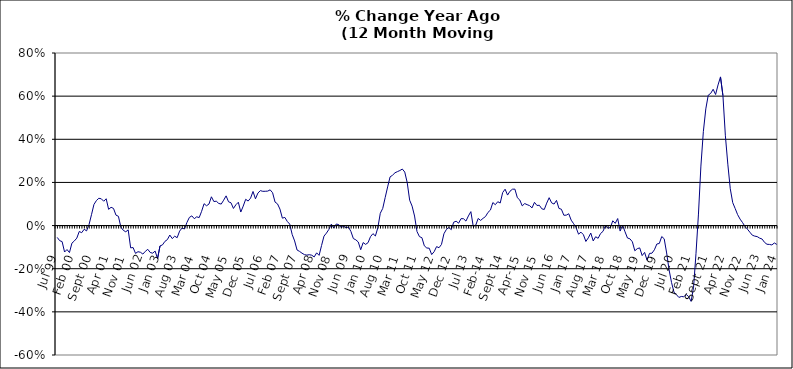
| Category | Series 0 |
|---|---|
| Jul 99 | -0.055 |
| Aug 99 | -0.07 |
| Sep 99 | -0.074 |
| Oct 99 | -0.123 |
| Nov 99 | -0.111 |
| Dec 99 | -0.125 |
| Jan 00 | -0.082 |
| Feb 00 | -0.071 |
| Mar 00 | -0.058 |
| Apr 00 | -0.027 |
| May 00 | -0.033 |
| Jun 00 | -0.017 |
| Jul 00 | -0.025 |
| Aug 00 | 0.005 |
| Sep 00 | 0.05 |
| Oct 00 | 0.098 |
| Nov 00 | 0.116 |
| Dec 00 | 0.127 |
| Jan 01 | 0.124 |
| Feb 01 | 0.113 |
| Mar 01 | 0.124 |
| Apr 01 | 0.075 |
| May 01 | 0.085 |
| Jun 01 | 0.08 |
| Jul 01 | 0.048 |
| Aug 01 | 0.043 |
| Sep 01 | -0.007 |
| Oct 01 | -0.022 |
| Nov 01 | -0.029 |
| Dec 01 | -0.02 |
| Jan 02 | -0.103 |
| Feb 02 | -0.102 |
| Mar 02 | -0.129 |
| Apr 02 | -0.121 |
| May 02 | -0.124 |
| Jun 02 | -0.132 |
| Jul 02 | -0.119 |
| Aug 02 | -0.11 |
| Sep 02 | -0.125 |
| Oct 02 | -0.128 |
| Nov 02 | -0.118 |
| Dec 02 | -0.153 |
| Jan 03 | -0.094 |
| Feb 03 | -0.09 |
| Mar 03 | -0.073 |
| Apr 03 | -0.065 |
| May 03 | -0.044 |
| Jun 03 | -0.06 |
| Jul 03 | -0.049 |
| Aug 03 | -0.056 |
| Sep 03 | -0.026 |
| Oct 03 | -0.012 |
| Nov 03 | -0.016 |
| Dec 03 | 0.014 |
| Jan 04 | 0.038 |
| Feb 04 | 0.045 |
| Mar 04 | 0.032 |
| Apr 04 | 0.041 |
| May 04 | 0.037 |
| Jun 04 | 0.066 |
| Jul 04 | 0.101 |
| Aug 04 | 0.092 |
| Sep 04 | 0.1 |
| Oct 04 | 0.133 |
| Nov 04 | 0.111 |
| Dec 04 | 0.113 |
| Jan 05 | 0.103 |
| Feb 05 | 0.1 |
| Mar 05 | 0.118 |
| Apr 05 | 0.138 |
| May 05 | 0.11 |
| Jun 05 | 0.106 |
| Jul 05 | 0.079 |
| Aug 05 | 0.097 |
| Sep 05 | 0.108 |
| Oct 05 | 0.063 |
| Nov 05 | 0.09 |
| Dec 05 | 0.122 |
| Jan 06 | 0.114 |
| Feb 06 | 0.127 |
| Mar 06 | 0.158 |
| Apr 06 | 0.124 |
| May 06 | 0.151 |
| Jun 06 | 0.162 |
| Jul 06 | 0.159 |
| Aug 06 | 0.159 |
| Sep 06 | 0.16 |
| Oct 06 | 0.166 |
| Nov 06 | 0.152 |
| Dec 06 | 0.109 |
| Jan 07 | 0.101 |
| Feb 07 | 0.076 |
| Mar 07 | 0.034 |
| Apr 07 | 0.038 |
| May 07 | 0.019 |
| Jun 07 | 0.007 |
| Jul 07 | -0.041 |
| Aug 07 | -0.071 |
| Sep 07 | -0.113 |
| Oct 07 | -0.12 |
| Nov 07 | -0.128 |
| Dec 07 | -0.135 |
| Jan 08 | -0.137 |
| Feb 08 | -0.135 |
| Mar 08 | -0.137 |
| Apr 08 | -0.145 |
| May 08 | -0.126 |
| Jun 08 | -0.138 |
| Jul 08 | -0.093 |
| Aug 08 | -0.049 |
| Sep-08 | -0.035 |
| Oct 08 | -0.018 |
| Nov 08 | 0.007 |
| Dec 08 | -0.011 |
| Jan 09 | 0.007 |
| Feb 09 | 0.005 |
| Mar 09 | -0.009 |
| Apr 09 | -0.003 |
| May 09 | -0.01 |
| Jun 09 | -0.007 |
| Jul 09 | -0.027 |
| Aug 09 | -0.06 |
| Sep 09 | -0.066 |
| Oct 09 | -0.076 |
| Nov 09 | -0.112 |
| Dec 09 | -0.079 |
| Jan 10 | -0.087 |
| Feb 10 | -0.079 |
| Mar 10 | -0.052 |
| Apr 10 | -0.037 |
| May 10 | -0.048 |
| Jun 10 | -0.01 |
| Jul 10 | 0.057 |
| Aug 10 | 0.08 |
| Sep 10 | 0.13 |
| Oct 10 | 0.179 |
| Nov 10 | 0.226 |
| Dec 10 | 0.233 |
| Jan 11 | 0.245 |
| Feb 11 | 0.25 |
| Mar 11 | 0.255 |
| Apr 11 | 0.262 |
| May 11 | 0.248 |
| Jun 11 | 0.199 |
| Jul 11 | 0.118 |
| Aug 11 | 0.09 |
| Sep 11 | 0.044 |
| Oct 11 | -0.028 |
| Nov 11 | -0.051 |
| Dec 11 | -0.056 |
| Jan 12 | -0.094 |
| Feb 12 | -0.104 |
| Mar 12 | -0.105 |
| Apr 12 | -0.134 |
| May 12 | -0.121 |
| Jun 12 | -0.098 |
| Jul 12 | -0.103 |
| Aug 12 | -0.087 |
| Sep 12 | -0.038 |
| Oct 12 | -0.018 |
| Nov 12 | -0.009 |
| Dec 12 | -0.019 |
| Jan 13 | 0.016 |
| Feb-13 | 0.02 |
| Mar-13 | 0.011 |
| Apr 13 | 0.032 |
| May 13 | 0.032 |
| Jun-13 | 0.021 |
| Jul 13 | 0.045 |
| Aug 13 | 0.065 |
| Sep 13 | -0.005 |
| Oct 13 | 0.002 |
| Nov 13 | 0.033 |
| Dec 13 | 0.024 |
| Jan 14 | 0.034 |
| Feb-14 | 0.042 |
| Mar 14 | 0.061 |
| Apr 14 | 0.072 |
| May 14 | 0.107 |
| Jun 14 | 0.097 |
| Jul-14 | 0.111 |
| Aug-14 | 0.105 |
| Sep 14 | 0.153 |
| Oct 14 | 0.169 |
| Nov 14 | 0.141 |
| Dec 14 | 0.159 |
| Jan 15 | 0.169 |
| Feb 15 | 0.169 |
| Mar 15 | 0.129 |
| Apr-15 | 0.118 |
| May 15 | 0.091 |
| Jun-15 | 0.102 |
| Jul 15 | 0.097 |
| Aug 15 | 0.092 |
| Sep 15 | 0.082 |
| Oct 15 | 0.108 |
| Nov 15 | 0.093 |
| Dec 15 | 0.094 |
| Jan 16 | 0.078 |
| Feb 16 | 0.075 |
| Mar 16 | 0.104 |
| Apr 16 | 0.129 |
| May 16 | 0.105 |
| Jun 16 | 0.1 |
| Jul 16 | 0.117 |
| Aug 16 | 0.08 |
| Sep 16 | 0.076 |
| Oct 16 | 0.048 |
| Nov 16 | 0.048 |
| Dec 16 | 0.055 |
| Jan 17 | 0.025 |
| Feb 17 | 0.009 |
| Mar 17 | -0.01 |
| Apr 17 | -0.04 |
| May 17 | -0.031 |
| Jun 17 | -0.042 |
| Jul 17 | -0.074 |
| Aug 17 | -0.057 |
| Sep 17 | -0.035 |
| Oct 17 | -0.071 |
| Nov 17 | -0.052 |
| Dec 17 | -0.059 |
| Jan 18 | -0.037 |
| Feb 18 | -0.027 |
| Mar 18 | 0 |
| Apr 18 | -0.012 |
| May 18 | -0.009 |
| Jun 18 | 0.022 |
| Jul 18 | 0.01 |
| Aug 18 | 0.033 |
| Sep 18 | -0.025 |
| Oct 18 | 0.002 |
| Nov 18 | -0.029 |
| Dec 18 | -0.058 |
| Jan 19 | -0.061 |
| Feb 19 | -0.075 |
| Mar 19 | -0.117 |
| Apr 19 | -0.107 |
| May 19 | -0.104 |
| Jun 19 | -0.139 |
| Jul 19 | -0.124 |
| Aug 19 | -0.16 |
| Sep 19 | -0.129 |
| Oct 19 | -0.128 |
| Nov 19 | -0.112 |
| Dec 19 | -0.085 |
| Jan 20 | -0.083 |
| Feb 20 | -0.051 |
| Mar 20 | -0.061 |
| Apr 20 | -0.127 |
| May 20 | -0.206 |
| Jun 20 | -0.264 |
| Jul 20 | -0.308 |
| Aug 20 | -0.32 |
| Sep 20 | -0.333 |
| Oct 20 | -0.329 |
| Nov 20 | -0.33 |
| Dec 20 | -0.319 |
| Jan 21 | -0.329 |
| Feb 21 | -0.352 |
| Mar 21 | -0.286 |
| Apr 21 | -0.129 |
| May 21 | 0.053 |
| Jun 21 | 0.276 |
| Jul 21 | 0.435 |
| Aug 21 | 0.541 |
| Sep 21 | 0.604 |
| Oct 21 | 0.613 |
| Nov 21 | 0.632 |
| Dec 21 | 0.608 |
| Jan 22 | 0.652 |
| Feb 22 | 0.689 |
| Mar 22 | 0.603 |
| Apr 22 | 0.416 |
| May 22 | 0.285 |
| Jun 22 | 0.171 |
| Jul 22 | 0.106 |
| Aug 22 | 0.079 |
| Sep 22 | 0.051 |
| Oct 22 | 0.03 |
| Nov 22 | 0.014 |
| Dec 22 | -0.004 |
| Jan 23 | -0.017 |
| Feb 23 | -0.031 |
| Mar 23 | -0.045 |
| Apr 23 | -0.049 |
| May 23 | -0.051 |
| Jun 23 | -0.058 |
| Jul 23 | -0.062 |
| Aug 23 | -0.078 |
| Sep 23 | -0.087 |
| Oct 23 | -0.087 |
| Nov 23 | -0.09 |
| Dec 23 | -0.081 |
| Jan 24 | -0.087 |